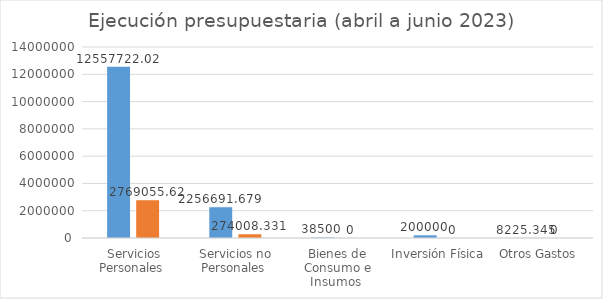
| Category | Series 0 | Series 1 |
|---|---|---|
| Servicios Personales  | 12557722.021 | 2769055.62 |
| Servicios no Personales  | 2256691.679 | 274008.331 |
| Bienes de Consumo e Insumos  | 38500 | 0 |
| Inversión Física | 200000 | 0 |
| Otros Gastos  | 8225.345 | 0 |